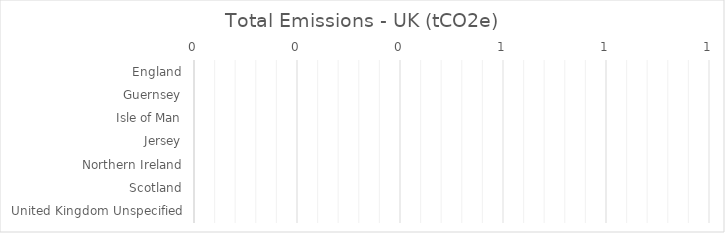
| Category | Total Emissions - UK (tCO2e) |
|---|---|
| England | 0 |
| Guernsey | 0 |
| Isle of Man | 0 |
| Jersey | 0 |
| Northern Ireland | 0 |
| Scotland | 0 |
| United Kingdom Unspecified | 0 |